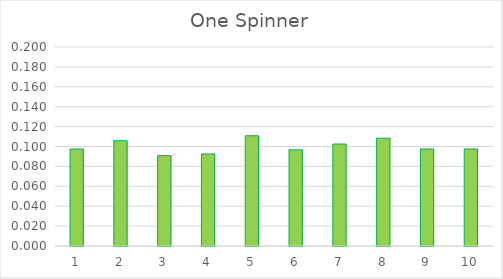
| Category | Series 0 |
|---|---|
| 0 | 0.098 |
| 1 | 0.106 |
| 2 | 0.091 |
| 3 | 0.092 |
| 4 | 0.111 |
| 5 | 0.097 |
| 6 | 0.102 |
| 7 | 0.108 |
| 8 | 0.098 |
| 9 | 0.098 |